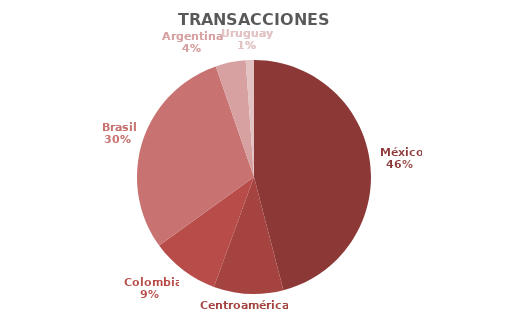
| Category | Series 0 |
|---|---|
| México | 2223.148 |
| Centroamérica  | 465.26 |
| Colombia | 457.789 |
| Brasil | 1435.686 |
| Argentina  | 200.899 |
| Uruguay  | 54.994 |